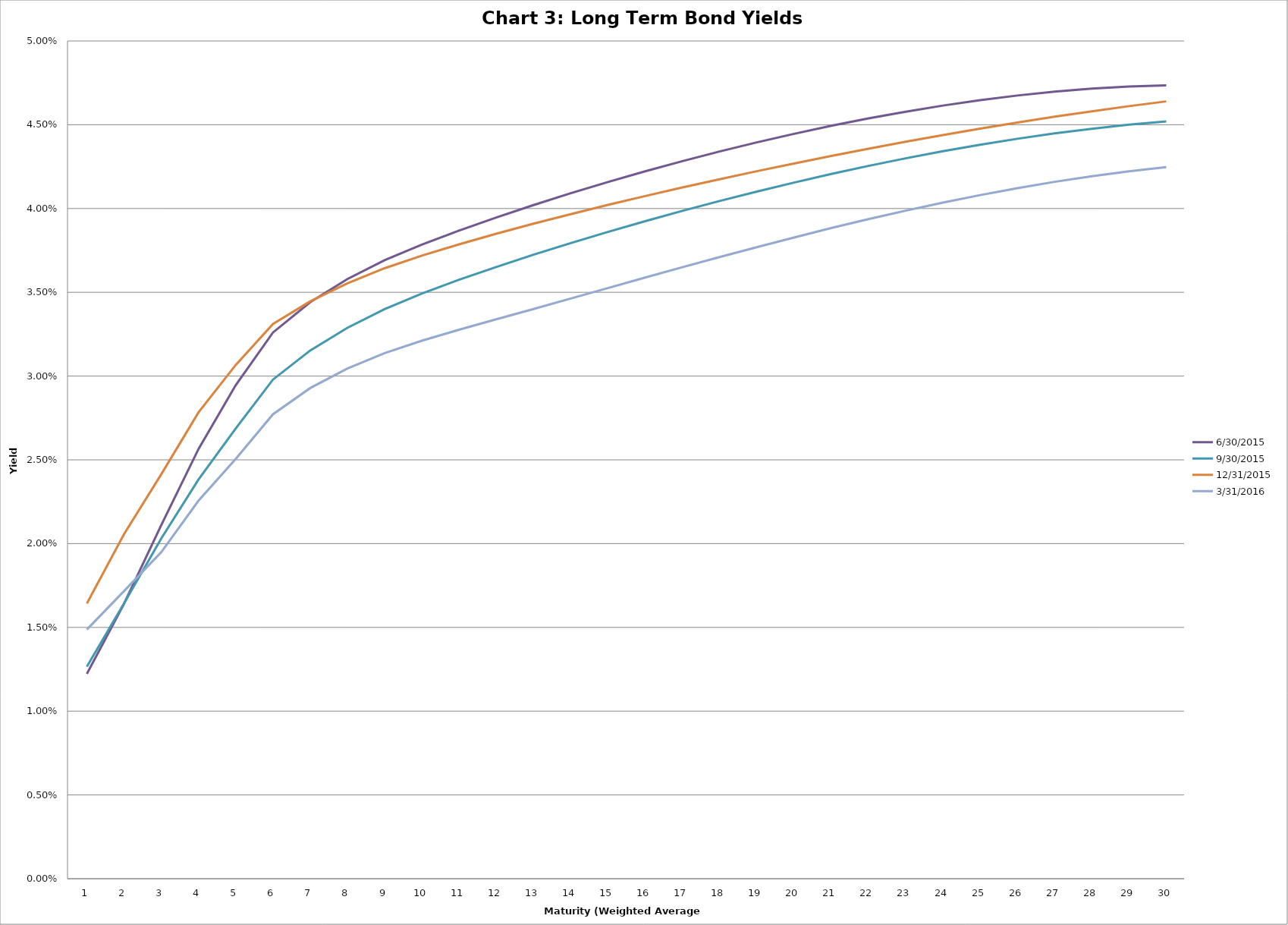
| Category | 6/30/2015 | 9/30/2015 | 12/31/2015 | 3/31/2016 |
|---|---|---|---|---|
| 0 | 0.012 | 0.013 | 0.016 | 0.015 |
| 1 | 0.016 | 0.016 | 0.021 | 0.017 |
| 2 | 0.021 | 0.02 | 0.024 | 0.019 |
| 3 | 0.026 | 0.024 | 0.028 | 0.023 |
| 4 | 0.029 | 0.027 | 0.031 | 0.025 |
| 5 | 0.033 | 0.03 | 0.033 | 0.028 |
| 6 | 0.034 | 0.032 | 0.034 | 0.029 |
| 7 | 0.036 | 0.033 | 0.036 | 0.03 |
| 8 | 0.037 | 0.034 | 0.036 | 0.031 |
| 9 | 0.038 | 0.035 | 0.037 | 0.032 |
| 10 | 0.039 | 0.036 | 0.038 | 0.033 |
| 11 | 0.039 | 0.037 | 0.038 | 0.033 |
| 12 | 0.04 | 0.037 | 0.039 | 0.034 |
| 13 | 0.041 | 0.038 | 0.04 | 0.035 |
| 14 | 0.042 | 0.039 | 0.04 | 0.035 |
| 15 | 0.042 | 0.039 | 0.041 | 0.036 |
| 16 | 0.043 | 0.04 | 0.041 | 0.036 |
| 17 | 0.043 | 0.04 | 0.042 | 0.037 |
| 18 | 0.044 | 0.041 | 0.042 | 0.038 |
| 19 | 0.044 | 0.042 | 0.043 | 0.038 |
| 20 | 0.045 | 0.042 | 0.043 | 0.039 |
| 21 | 0.045 | 0.043 | 0.044 | 0.039 |
| 22 | 0.046 | 0.043 | 0.044 | 0.04 |
| 23 | 0.046 | 0.043 | 0.044 | 0.04 |
| 24 | 0.046 | 0.044 | 0.045 | 0.041 |
| 25 | 0.047 | 0.044 | 0.045 | 0.041 |
| 26 | 0.047 | 0.044 | 0.045 | 0.042 |
| 27 | 0.047 | 0.045 | 0.046 | 0.042 |
| 28 | 0.047 | 0.045 | 0.046 | 0.042 |
| 29 | 0.047 | 0.045 | 0.046 | 0.042 |